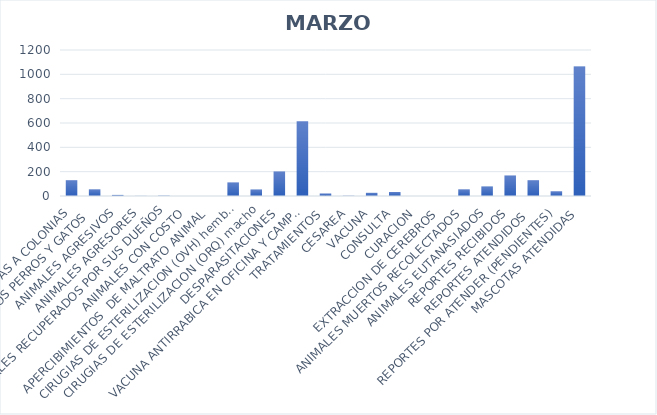
| Category | Series 0 |
|---|---|
| VISITAS A COLONIAS | 130 |
| ANIMALES CAPTURADOS PERROS Y GATOS  | 55 |
| ANIMALES AGRESIVOS | 9 |
| ANIMALES AGRESORES | 1 |
| ANIMALES RECUPERADOS POR SUS DUEÑOS | 3 |
| ANIMALES CON COSTO | 0 |
| APERCIBIMIENTOS  DE MALTRATO ANIMAL | 0 |
| CIRUGIAS DE ESTERILIZACION (OVH) hembra | 112 |
| CIRUGIAS DE ESTERILIZACION (ORQ) macho | 53 |
| DESPARASITACIONES | 202 |
| VACUNA ANTIRRABICA EN OFICINA Y CAMPAÑAS  | 615 |
| TRATAMIENTOS | 21 |
| CESAREA | 2 |
| VACUNA | 26 |
| CONSULTA | 33 |
| CURACION | 0 |
| EXTRACCION DE CEREBROS | 0 |
| ANIMALES MUERTOS RECOLECTADOS | 55 |
| ANIMALES EUTANASIADOS | 78 |
| REPORTES RECIBIDOS | 169 |
| REPORTES ATENDIDOS  | 130 |
| REPORTES POR ATENDER (PENDIENTES) | 39 |
| MASCOTAS ATENDIDAS | 1064 |